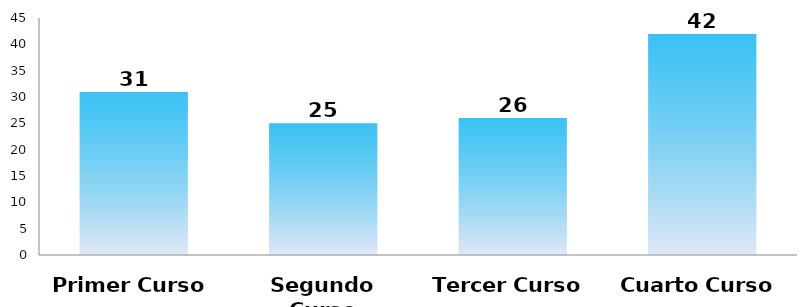
| Category | Series 0 |
|---|---|
| Primer Curso | 31 |
| Segundo Curso | 25 |
| Tercer Curso | 26 |
| Cuarto Curso | 42 |